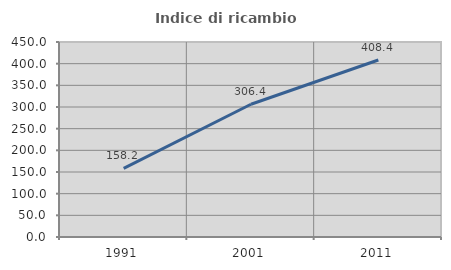
| Category | Indice di ricambio occupazionale  |
|---|---|
| 1991.0 | 158.221 |
| 2001.0 | 306.377 |
| 2011.0 | 408.401 |